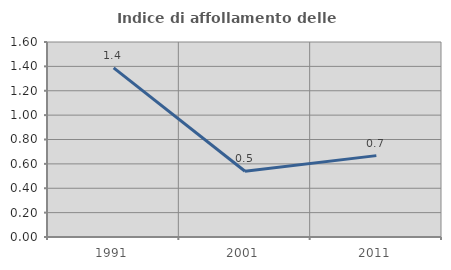
| Category | Indice di affollamento delle abitazioni  |
|---|---|
| 1991.0 | 1.388 |
| 2001.0 | 0.54 |
| 2011.0 | 0.668 |